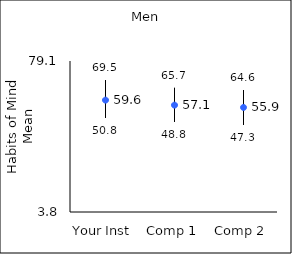
| Category | 25th percentile | 75th percentile | Mean |
|---|---|---|---|
| Your Inst | 50.8 | 69.5 | 59.59 |
| Comp 1 | 48.8 | 65.7 | 57.09 |
| Comp 2 | 47.3 | 64.6 | 55.94 |